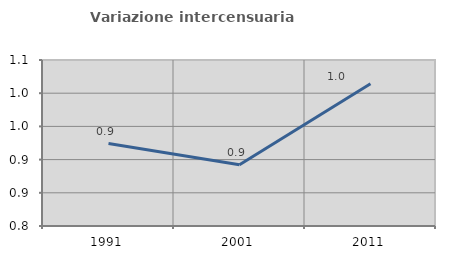
| Category | Variazione intercensuaria annua |
|---|---|
| 1991.0 | 0.924 |
| 2001.0 | 0.892 |
| 2011.0 | 1.014 |